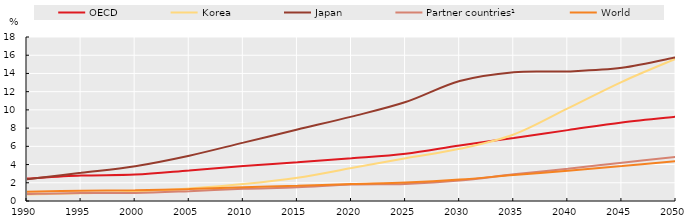
| Category | OECD | Korea | Japan | Partner countries¹ | World  |
|---|---|---|---|---|---|
| 1990.0 | 2.466 | 0.705 | 2.396 | 0.763 | 1.017 |
| 1995.0 | 2.792 | 0.848 | 3.093 | 0.883 | 1.128 |
| 2000.0 | 2.902 | 1.028 | 3.826 | 0.882 | 1.167 |
| 2005.0 | 3.354 | 1.379 | 4.977 | 1.081 | 1.308 |
| 2010.0 | 3.841 | 1.862 | 6.404 | 1.337 | 1.498 |
| 2015.0 | 4.256 | 2.559 | 7.844 | 1.502 | 1.67 |
| 2020.0 | 4.686 | 3.619 | 9.263 | 1.802 | 1.867 |
| 2025.0 | 5.187 | 4.703 | 10.86 | 1.871 | 2.024 |
| 2030.0 | 6.092 | 5.733 | 13.17 | 2.237 | 2.353 |
| 2035.0 | 6.922 | 7.304 | 14.141 | 2.931 | 2.862 |
| 2040.0 | 7.779 | 10.168 | 14.227 | 3.546 | 3.316 |
| 2045.0 | 8.625 | 13.082 | 14.613 | 4.199 | 3.832 |
| 2050.0 | 9.25 | 15.619 | 15.765 | 4.836 | 4.38 |